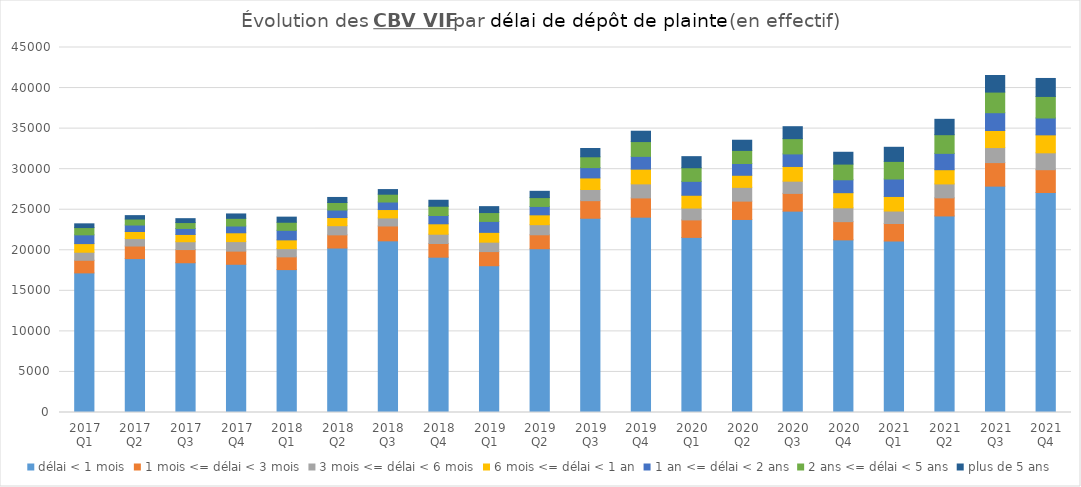
| Category | délai < 1 mois | 1 mois <= délai < 3 mois | 3 mois <= délai < 6 mois | 6 mois <= délai < 1 an | 1 an <= délai < 2 ans | 2 ans <= délai < 5 ans | plus de 5 ans |
|---|---|---|---|---|---|---|---|
| 2017 Q1 | 17213 | 1555 | 991 | 1064 | 1080 | 894 | 463 |
| 2017 Q2 | 18976 | 1548 | 922 | 866 | 803 | 735 | 422 |
| 2017 Q3 | 18463 | 1627 | 965 | 896 | 740 | 726 | 480 |
| 2017 Q4 | 18274 | 1622 | 1173 | 1088 | 835 | 948 | 539 |
| 2018 Q1 | 17618 | 1570 | 1014 | 1081 | 1180 | 992 | 631 |
| 2018 Q2 | 20278 | 1624 | 1131 | 1002 | 929 | 925 | 623 |
| 2018 Q3 | 21165 | 1830 | 992 | 1036 | 927 | 962 | 572 |
| 2018 Q4 | 19149 | 1684 | 1146 | 1287 | 1025 | 1138 | 738 |
| 2019 Q1 | 18097 | 1742 | 1160 | 1209 | 1351 | 1092 | 729 |
| 2019 Q2 | 20191 | 1720 | 1246 | 1213 | 1035 | 1089 | 775 |
| 2019 Q3 | 23950 | 2167 | 1376 | 1426 | 1274 | 1333 | 1021 |
| 2019 Q4 | 24081 | 2373 | 1733 | 1816 | 1575 | 1823 | 1277 |
| 2020 Q1 | 21588 | 2157 | 1461 | 1576 | 1717 | 1675 | 1369 |
| 2020 Q2 | 23799 | 2261 | 1698 | 1488 | 1454 | 1612 | 1256 |
| 2020 Q3 | 24827 | 2185 | 1508 | 1814 | 1548 | 1883 | 1471 |
| 2020 Q4 | 21283 | 2247 | 1706 | 1865 | 1592 | 1932 | 1458 |
| 2021 Q1 | 21142 | 2162 | 1533 | 1798 | 2153 | 2170 | 1739 |
| 2021 Q2 | 24233 | 2229 | 1718 | 1754 | 2015 | 2301 | 1896 |
| 2021 Q3 | 27909 | 2900 | 1855 | 2105 | 2192 | 2541 | 2044 |
| 2021 Q4 | 27126 | 2809 | 2081 | 2214 | 2081 | 2656 | 2215 |